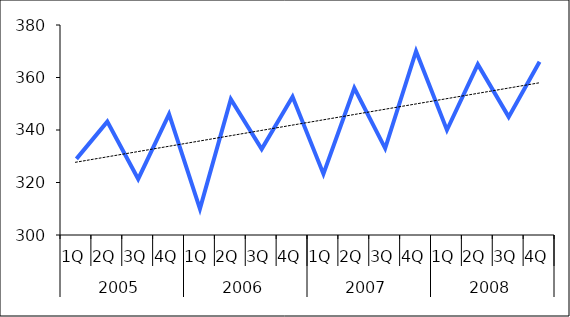
| Category | Średnia cena |
|---|---|
| 0 | 329 |
| 1 | 343.2 |
| 2 | 321.35 |
| 3 | 346.05 |
| 4 | 310 |
| 5 | 351.75 |
| 6 | 332.75 |
| 7 | 352.7 |
| 8 | 323.251 |
| 9 | 356 |
| 10 | 333 |
| 11 | 370 |
| 12 | 340 |
| 13 | 365 |
| 14 | 345 |
| 15 | 366 |